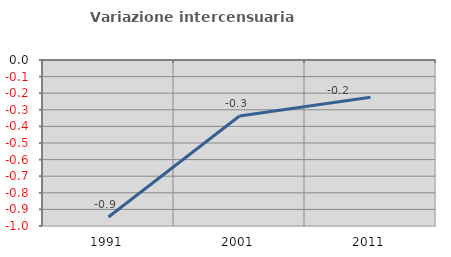
| Category | Variazione intercensuaria annua |
|---|---|
| 1991.0 | -0.946 |
| 2001.0 | -0.337 |
| 2011.0 | -0.224 |